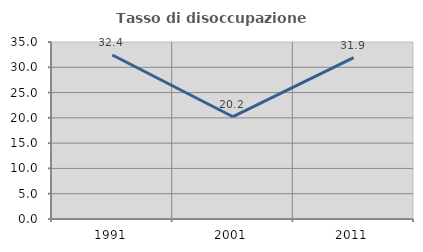
| Category | Tasso di disoccupazione giovanile  |
|---|---|
| 1991.0 | 32.432 |
| 2001.0 | 20.225 |
| 2011.0 | 31.915 |